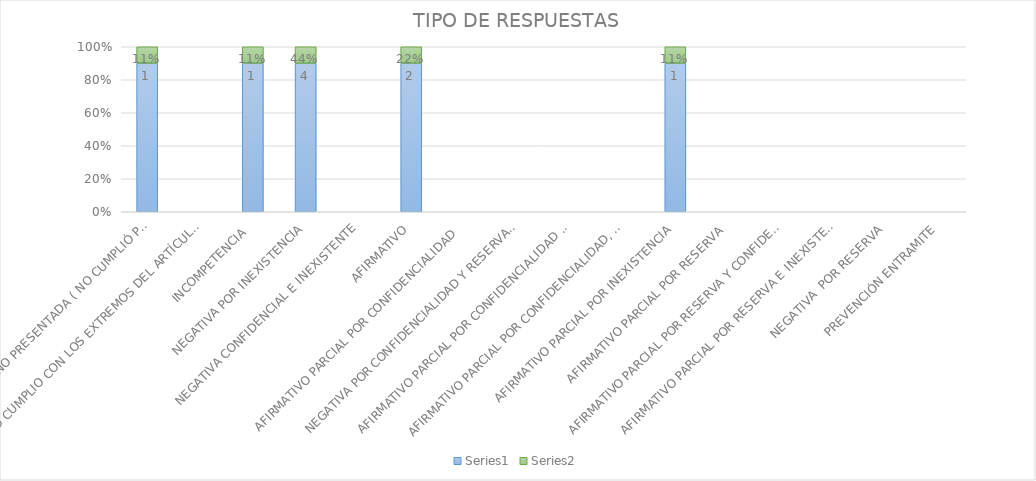
| Category | Series 4 | Series 5 |
|---|---|---|
| SE TIENE POR NO PRESENTADA ( NO CUMPLIÓ PREVENCIÓN) | 1 | 0.111 |
| NO CUMPLIO CON LOS EXTREMOS DEL ARTÍCULO 79 (REQUISITOS) | 0 | 0 |
| INCOMPETENCIA  | 1 | 0.111 |
| NEGATIVA POR INEXISTENCIA | 4 | 0.444 |
| NEGATIVA CONFIDENCIAL E INEXISTENTE | 0 | 0 |
| AFIRMATIVO | 2 | 0.222 |
| AFIRMATIVO PARCIAL POR CONFIDENCIALIDAD  | 0 | 0 |
| NEGATIVA POR CONFIDENCIALIDAD Y RESERVADA | 0 | 0 |
| AFIRMATIVO PARCIAL POR CONFIDENCIALIDAD E INEXISTENCIA | 0 | 0 |
| AFIRMATIVO PARCIAL POR CONFIDENCIALIDAD, RESERVA E INEXISTENCIA | 0 | 0 |
| AFIRMATIVO PARCIAL POR INEXISTENCIA | 1 | 0.111 |
| AFIRMATIVO PARCIAL POR RESERVA | 0 | 0 |
| AFIRMATIVO PARCIAL POR RESERVA Y CONFIDENCIALIDAD | 0 | 0 |
| AFIRMATIVO PARCIAL POR RESERVA E INEXISTENCIA | 0 | 0 |
| NEGATIVA  POR RESERVA | 0 | 0 |
| PREVENCIÓN ENTRAMITE | 0 | 0 |